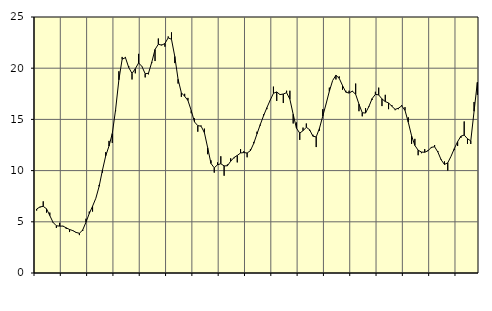
| Category | Piggar | Series 1 |
|---|---|---|
| nan | 6.1 | 6.25 |
| 87.0 | 6.4 | 6.45 |
| 87.0 | 7 | 6.51 |
| 87.0 | 5.9 | 6.27 |
| nan | 5.9 | 5.61 |
| 88.0 | 4.9 | 4.94 |
| 88.0 | 4.4 | 4.61 |
| 88.0 | 4.9 | 4.58 |
| nan | 4.6 | 4.58 |
| 89.0 | 4.3 | 4.41 |
| 89.0 | 4 | 4.25 |
| 89.0 | 4.1 | 4.14 |
| nan | 4 | 3.96 |
| 90.0 | 3.7 | 3.88 |
| 90.0 | 4.1 | 4.2 |
| 90.0 | 5.3 | 4.96 |
| nan | 6 | 5.81 |
| 91.0 | 6 | 6.52 |
| 91.0 | 7.3 | 7.3 |
| 91.0 | 8.6 | 8.46 |
| nan | 9.8 | 10.03 |
| 92.0 | 11.8 | 11.44 |
| 92.0 | 12.9 | 12.4 |
| 92.0 | 12.7 | 13.62 |
| nan | 15.8 | 15.93 |
| 93.0 | 19.7 | 18.86 |
| 93.0 | 21.1 | 20.88 |
| 93.0 | 21.1 | 21.03 |
| nan | 20.2 | 20.07 |
| 94.0 | 18.9 | 19.49 |
| 94.0 | 19.5 | 19.95 |
| 94.0 | 21.4 | 20.51 |
| nan | 20.2 | 20.18 |
| 95.0 | 19.1 | 19.46 |
| 95.0 | 19.4 | 19.5 |
| 95.0 | 20.5 | 20.58 |
| nan | 20.7 | 21.83 |
| 96.0 | 22.9 | 22.34 |
| 96.0 | 22.3 | 22.25 |
| 96.0 | 22.1 | 22.41 |
| nan | 23.1 | 22.97 |
| 97.0 | 23.5 | 22.82 |
| 97.0 | 20.5 | 21.15 |
| 97.0 | 18.5 | 18.92 |
| nan | 17.2 | 17.6 |
| 98.0 | 17.5 | 17.26 |
| 98.0 | 17.1 | 16.85 |
| 98.0 | 15.6 | 15.87 |
| nan | 15.1 | 14.75 |
| 99.0 | 13.8 | 14.39 |
| 99.0 | 14.4 | 14.34 |
| 99.0 | 14.1 | 13.71 |
| nan | 11.6 | 12.24 |
| 0.0 | 11 | 10.7 |
| 0.0 | 9.8 | 10.27 |
| 0.0 | 10.8 | 10.57 |
| nan | 11.4 | 10.67 |
| 1.0 | 9.5 | 10.46 |
| 1.0 | 10.6 | 10.47 |
| 1.0 | 11.2 | 10.92 |
| nan | 11.2 | 11.27 |
| 2.0 | 10.8 | 11.48 |
| 2.0 | 12.1 | 11.72 |
| 2.0 | 11.9 | 11.76 |
| nan | 11.3 | 11.72 |
| 3.0 | 12.1 | 11.95 |
| 3.0 | 12.8 | 12.65 |
| 3.0 | 13.8 | 13.59 |
| nan | 14.4 | 14.5 |
| 4.0 | 15.5 | 15.36 |
| 4.0 | 16 | 16.14 |
| 4.0 | 16.9 | 16.87 |
| nan | 18.2 | 17.55 |
| 5.0 | 16.8 | 17.68 |
| 5.0 | 17.4 | 17.42 |
| 5.0 | 16.6 | 17.48 |
| nan | 17.8 | 17.61 |
| 6.0 | 17.8 | 16.97 |
| 6.0 | 14.6 | 15.5 |
| 6.0 | 14.7 | 14.14 |
| nan | 13 | 13.66 |
| 7.0 | 14.2 | 13.9 |
| 7.0 | 14.6 | 14.23 |
| 7.0 | 13.9 | 13.99 |
| nan | 13.5 | 13.36 |
| 8.0 | 12.3 | 13.29 |
| 8.0 | 13.9 | 14.14 |
| 8.0 | 16 | 15.32 |
| nan | 16.5 | 16.51 |
| 9.0 | 18.1 | 17.75 |
| 9.0 | 18.8 | 18.8 |
| 9.0 | 18.9 | 19.31 |
| nan | 19.2 | 19.01 |
| 10.0 | 17.9 | 18.31 |
| 10.0 | 17.8 | 17.66 |
| 10.0 | 17.8 | 17.57 |
| nan | 17.7 | 17.76 |
| 11.0 | 18.5 | 17.45 |
| 11.0 | 15.8 | 16.49 |
| 11.0 | 15.3 | 15.65 |
| nan | 16.1 | 15.62 |
| 12.0 | 16.3 | 16.24 |
| 12.0 | 16.9 | 17.03 |
| 12.0 | 17.7 | 17.45 |
| nan | 18.1 | 17.39 |
| 13.0 | 16.3 | 17 |
| 13.0 | 17.4 | 16.74 |
| 13.0 | 16 | 16.61 |
| nan | 16.4 | 16.28 |
| 14.0 | 15.9 | 15.98 |
| 14.0 | 16 | 16.09 |
| 14.0 | 16.4 | 16.32 |
| nan | 16.2 | 15.88 |
| 15.0 | 15.2 | 14.72 |
| 15.0 | 12.6 | 13.4 |
| 15.0 | 13.1 | 12.46 |
| nan | 11.5 | 11.99 |
| 16.0 | 11.7 | 11.81 |
| 16.0 | 12.1 | 11.79 |
| 16.0 | 12 | 11.94 |
| nan | 12.2 | 12.27 |
| 17.0 | 12.5 | 12.33 |
| 17.0 | 11.9 | 11.81 |
| 17.0 | 11.1 | 11.05 |
| nan | 10.9 | 10.6 |
| 18.0 | 10 | 10.76 |
| 18.0 | 11.4 | 11.4 |
| 18.0 | 12 | 12.15 |
| nan | 12.4 | 12.83 |
| 19.0 | 13.2 | 13.36 |
| 19.0 | 14.8 | 13.47 |
| 19.0 | 12.6 | 13.11 |
| nan | 12.6 | 12.9 |
| 20.0 | 16.7 | 15.79 |
| 20.0 | 17.4 | 18.62 |